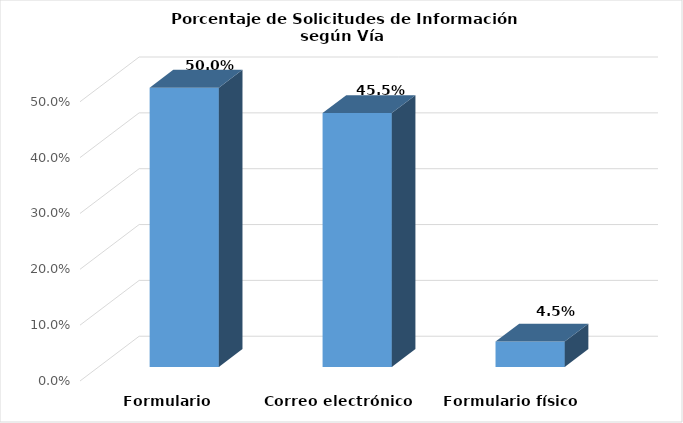
| Category | Series 0 |
|---|---|
| Formulario electrónico SAIP | 0.5 |
| Correo electrónico | 0.455 |
| Formulario físico | 0.045 |